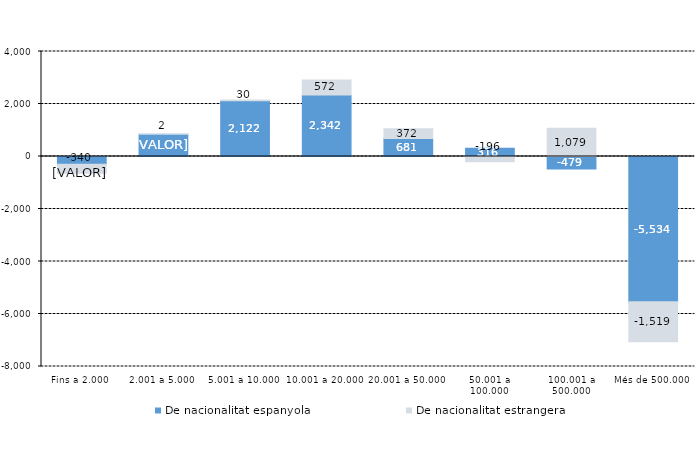
| Category | De nacionalitat espanyola | De nacionalitat estrangera |
|---|---|---|
| Fins a 2.000 | -297 | -340 |
| 2.001 a 5.000 | 849 | 2 |
| 5.001 a 10.000 | 2122 | 30 |
| 10.001 a 20.000 | 2342 | 572 |
| 20.001 a 50.000 | 681 | 372 |
| 50.001 a 100.000 | 316 | -196 |
| 100.001 a 500.000 | -479 | 1079 |
| Més de 500.000 | -5534 | -1519 |